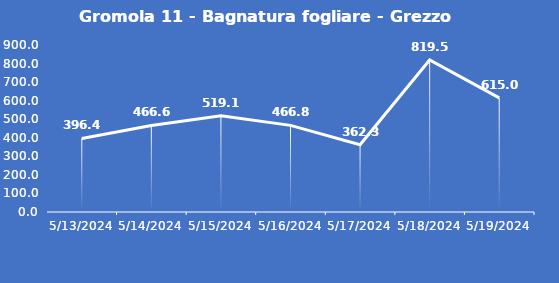
| Category | Gromola 11 - Bagnatura fogliare - Grezzo (min) |
|---|---|
| 5/13/24 | 396.4 |
| 5/14/24 | 466.6 |
| 5/15/24 | 519.1 |
| 5/16/24 | 466.8 |
| 5/17/24 | 362.3 |
| 5/18/24 | 819.5 |
| 5/19/24 | 615 |